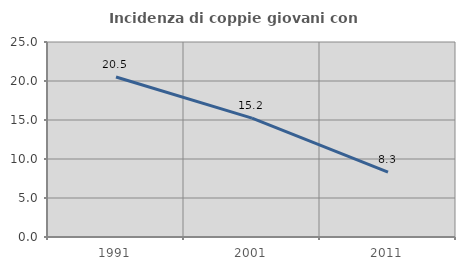
| Category | Incidenza di coppie giovani con figli |
|---|---|
| 1991.0 | 20.51 |
| 2001.0 | 15.233 |
| 2011.0 | 8.322 |